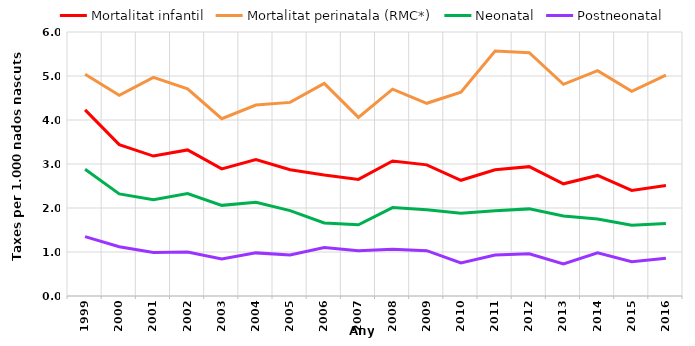
| Category | Mortalitat infantil | Mortalitat perinatala (RMC*) | Neonatal | Postneonatal |
|---|---|---|---|---|
| 1999.0 | 4.23 | 5.04 | 2.88 | 1.35 |
| 2000.0 | 3.44 | 4.56 | 2.32 | 1.12 |
| 2001.0 | 3.18 | 4.97 | 2.19 | 0.99 |
| 2002.0 | 3.32 | 4.71 | 2.33 | 1 |
| 2003.0 | 2.89 | 4.03 | 2.06 | 0.84 |
| 2004.0 | 3.1 | 4.34 | 2.13 | 0.98 |
| 2005.0 | 2.87 | 4.4 | 1.94 | 0.93 |
| 2006.0 | 2.75 | 4.83 | 1.66 | 1.1 |
| 2007.0 | 2.65 | 4.06 | 1.62 | 1.03 |
| 2008.0 | 3.07 | 4.7 | 2.01 | 1.06 |
| 2009.0 | 2.98 | 4.38 | 1.96 | 1.03 |
| 2010.0 | 2.63 | 4.63 | 1.88 | 0.75 |
| 2011.0 | 2.87 | 5.57 | 1.94 | 0.93 |
| 2012.0 | 2.94 | 5.53 | 1.98 | 0.96 |
| 2013.0 | 2.55 | 4.81 | 1.82 | 0.73 |
| 2014.0 | 2.74 | 5.12 | 1.75 | 0.98 |
| 2015.0 | 2.4 | 4.65 | 1.61 | 0.78 |
| 2016.0 | 2.51 | 5.02 | 1.65 | 0.86 |